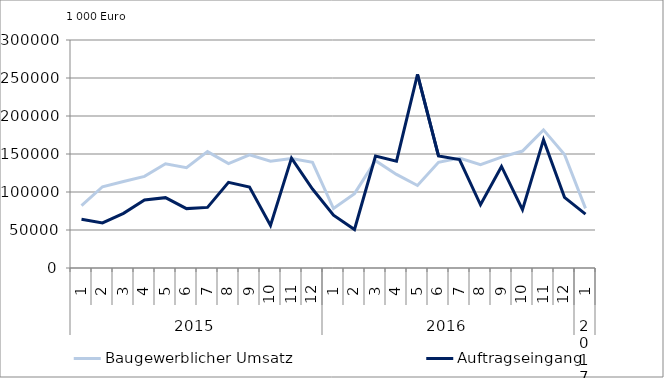
| Category | Baugewerblicher Umsatz | Auftragseingang |
|---|---|---|
| 0 | 81937.361 | 64244.383 |
| 1 | 106908.454 | 59377.677 |
| 2 | 113904.285 | 71953.971 |
| 3 | 120612.446 | 89496.024 |
| 4 | 137142.75 | 92563.213 |
| 5 | 132019.811 | 78131.737 |
| 6 | 153125.961 | 79765.729 |
| 7 | 137370.133 | 112637.987 |
| 8 | 148792.629 | 106572.56 |
| 9 | 140483.911 | 56073.767 |
| 10 | 144146.162 | 144643.688 |
| 11 | 139085.889 | 103931.175 |
| 12 | 78291.738 | 69470.357 |
| 13 | 97863.379 | 50640.033 |
| 14 | 141176.119 | 147206.65 |
| 15 | 123121.297 | 140579.009 |
| 16 | 108561.124 | 254739.334 |
| 17 | 139030.209 | 147481.644 |
| 18 | 144784.416 | 142609.658 |
| 19 | 135870.195 | 83192.156 |
| 20 | 145961.738 | 133594.351 |
| 21 | 153886.826 | 76793.838 |
| 22 | 181740.037 | 168867.568 |
| 23 | 149348.138 | 93011.853 |
| 24 | 78446.78 | 70908.903 |